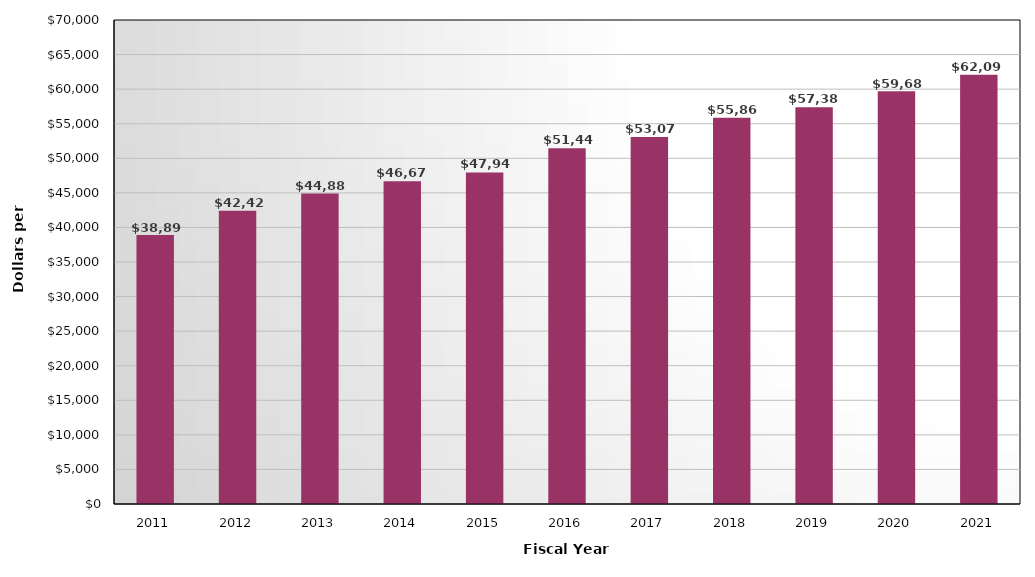
| Category | Tuition and Fees |
|---|---|
| 2011.0 | 38890 |
| 2012.0 | 42429 |
| 2013.0 | 44889 |
| 2014.0 | 46676 |
| 2015.0 | 47947 |
| 2016.0 | 51449 |
| 2017.0 | 53072 |
| 2018.0 | 55860 |
| 2019.0 | 57384 |
| 2020.0 | 59686 |
| 2021.0 | 62091 |